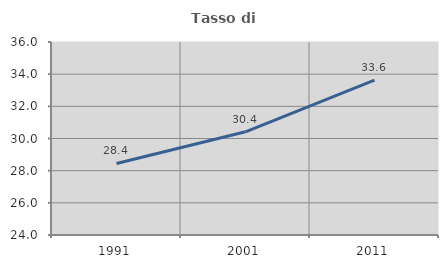
| Category | Tasso di occupazione   |
|---|---|
| 1991.0 | 28.446 |
| 2001.0 | 30.415 |
| 2011.0 | 33.632 |